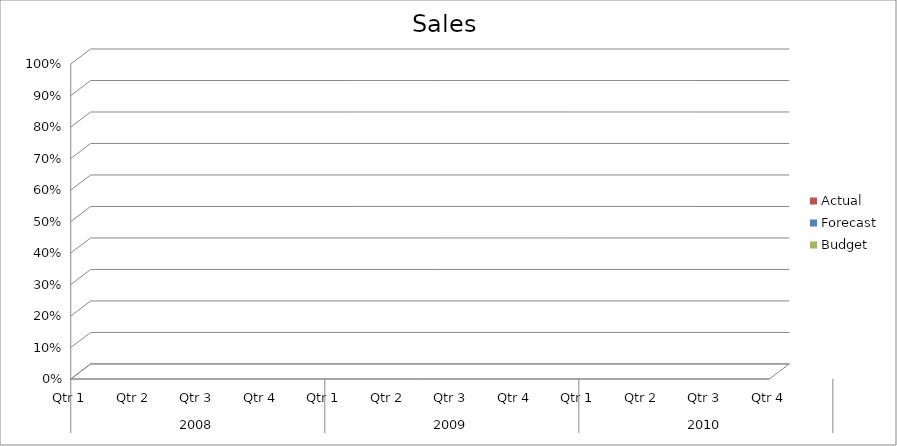
| Category | Budget | Forecast | Actual |
|---|---|---|---|
| 0 | 760 | 2980 | 520 |
| 1 | 1300 | 1260 | 3240 |
| 2 | 1060 | 2110 | 1990 |
| 3 | 1560 | 1170 | 1860 |
| 4 | 2320 | 1240 | 2000 |
| 5 | 2710 | 1940 | 1490 |
| 6 | 670 | 950 | 1790 |
| 7 | 2690 | 1350 | 750 |
| 8 | 2020 | 670 | 2750 |
| 9 | 1310 | 2460 | 2750 |
| 10 | 1910 | 3100 | 1650 |
| 11 | 1580 | 1130 | 880 |